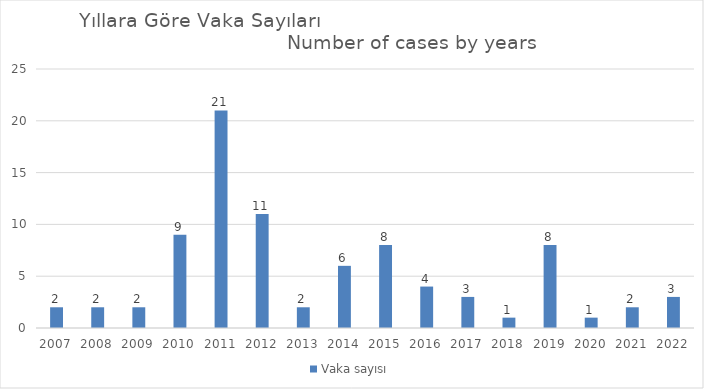
| Category | Vaka sayısı |
|---|---|
| 2007.0 | 2 |
| 2008.0 | 2 |
| 2009.0 | 2 |
| 2010.0 | 9 |
| 2011.0 | 21 |
| 2012.0 | 11 |
| 2013.0 | 2 |
| 2014.0 | 6 |
| 2015.0 | 8 |
| 2016.0 | 4 |
| 2017.0 | 3 |
| 2018.0 | 1 |
| 2019.0 | 8 |
| 2020.0 | 1 |
| 2021.0 | 2 |
| 2022.0 | 3 |